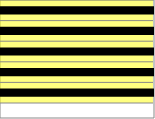
| Category | Series 0 |
|---|---|
| 0 | 1 |
| 1 | 1 |
| 2 | 1 |
| 3 | 1 |
| 4 | 1 |